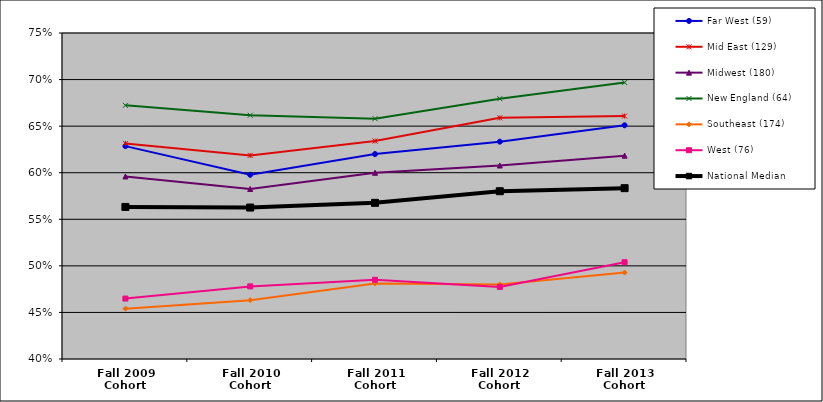
| Category | Far West (59) | Mid East (129) | Midwest (180) | New England (64) | Southeast (174) | West (76) | National Median |
|---|---|---|---|---|---|---|---|
| Fall 2009 Cohort | 0.629 | 0.631 | 0.596 | 0.672 | 0.454 | 0.465 | 0.563 |
| Fall 2010 Cohort | 0.598 | 0.619 | 0.583 | 0.662 | 0.463 | 0.478 | 0.563 |
| Fall 2011 Cohort | 0.62 | 0.634 | 0.6 | 0.658 | 0.481 | 0.485 | 0.568 |
| Fall 2012 Cohort | 0.633 | 0.659 | 0.608 | 0.679 | 0.48 | 0.477 | 0.58 |
| Fall 2013 Cohort | 0.651 | 0.661 | 0.618 | 0.697 | 0.493 | 0.504 | 0.583 |